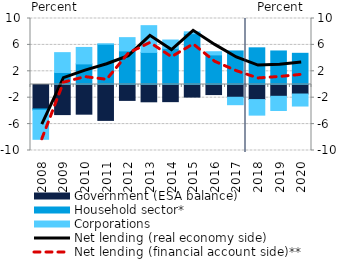
| Category | Government (ESA balance) | Household sector* | Corporations |
|---|---|---|---|
| 2008.0 | -3.698 | -0.202 | -4.404 |
| 2009.0 | -4.561 | 1.816 | 3.012 |
| 2010.0 | -4.497 | 3.122 | 2.493 |
| 2011.0 | -5.441 | 6.096 | 0.059 |
| 2012.0 | -2.409 | 5.095 | 2.005 |
| 2013.0 | -2.621 | 4.863 | 4.054 |
| 2014.0 | -2.599 | 5.462 | 1.278 |
| 2015.0 | -1.906 | 7.706 | 0.273 |
| 2016.0 | -1.527 | 4.487 | 0.48 |
| 2017.0 | -1.932 | 5.083 | -1.128 |
| 2018.0 | -2.285 | 5.557 | -2.356 |
| 2019.0 | -1.788 | 5.081 | -2.147 |
| 2020.0 | -1.44 | 4.726 | -1.822 |